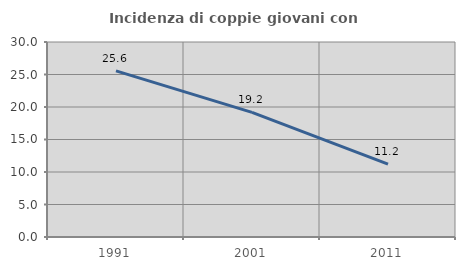
| Category | Incidenza di coppie giovani con figli |
|---|---|
| 1991.0 | 25.564 |
| 2001.0 | 19.173 |
| 2011.0 | 11.219 |